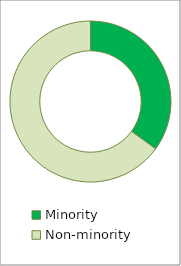
| Category | Series 0 |
|---|---|
| Minority | 0.35 |
| Non-minority | 0.65 |